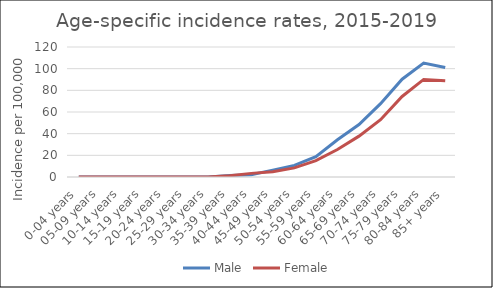
| Category | Male | Female |
|---|---|---|
| 0-04 years | 0 | 0 |
| 05-09 years | 0 | 0 |
| 10-14 years | 0 | 0 |
| 15-19 years | 0 | 0 |
| 20-24 years | 0 | 0 |
| 25-29 years | 0 | 0 |
| 30-34 years | 0 | 0 |
| 35-39 years | 1.43 | 1.19 |
| 40-44 years | 2.11 | 3.35 |
| 45-49 years | 6.34 | 4.81 |
| 50-54 years | 10.69 | 8.43 |
| 55-59 years | 18.68 | 15.13 |
| 60-64 years | 34.38 | 25.42 |
| 65-69 years | 48.41 | 37.71 |
| 70-74 years | 67.7 | 52.92 |
| 75-79 years | 90.29 | 74.34 |
| 80-84 years | 105.22 | 90.08 |
| 85+ years | 101.07 | 88.85 |